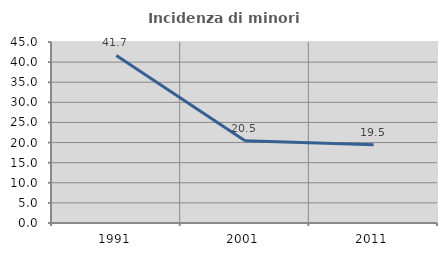
| Category | Incidenza di minori stranieri |
|---|---|
| 1991.0 | 41.667 |
| 2001.0 | 20.455 |
| 2011.0 | 19.463 |